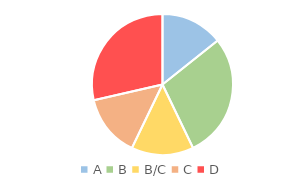
| Category | Series 0 |
|---|---|
| A | 1 |
| B | 2 |
| B/C | 1 |
| C | 1 |
| D | 2 |